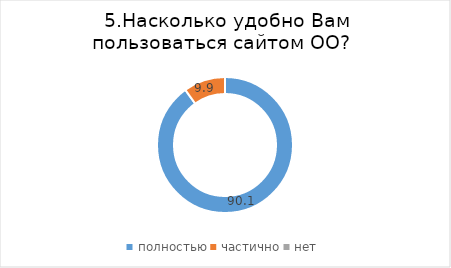
| Category | Series 0 |
|---|---|
| полностью | 90.071 |
| частично | 9.929 |
| нет | 0 |